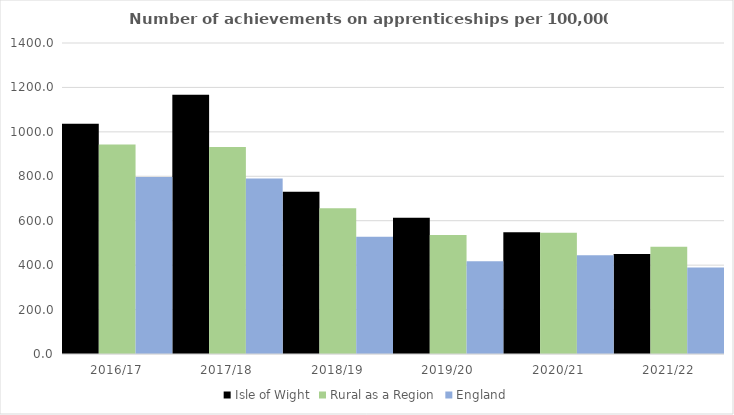
| Category | Isle of Wight | Rural as a Region | England |
|---|---|---|---|
| 2016/17 | 1037 | 942.594 | 797 |
| 2017/18 | 1167 | 931.709 | 790 |
| 2018/19 | 730 | 656.44 | 528 |
| 2019/20 | 613 | 535.552 | 418 |
| 2020/21 | 548 | 545.333 | 444 |
| 2021/22 | 450 | 482.936 | 389 |